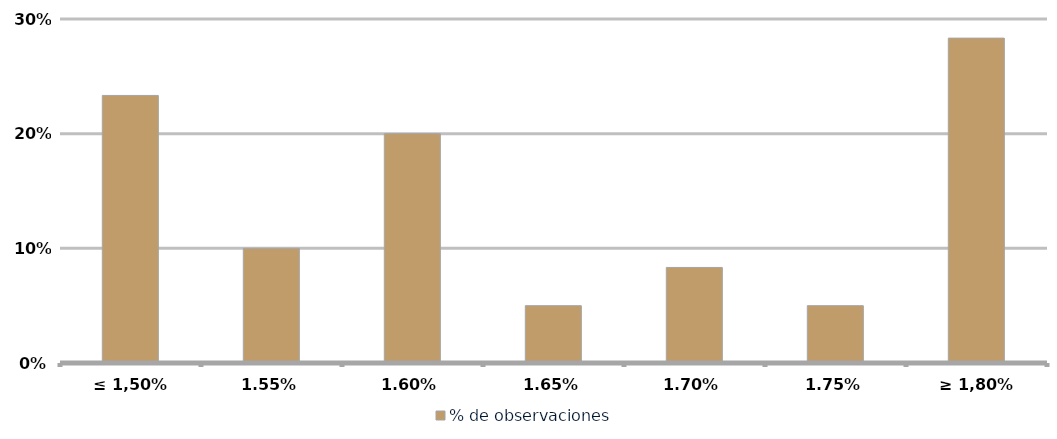
| Category | % de observaciones  |
|---|---|
| ≤ 1,50% | 0.233 |
| 1,55% | 0.1 |
| 1,60% | 0.2 |
| 1,65% | 0.05 |
| 1,70% | 0.083 |
| 1,75% | 0.05 |
| ≥ 1,80% | 0.283 |